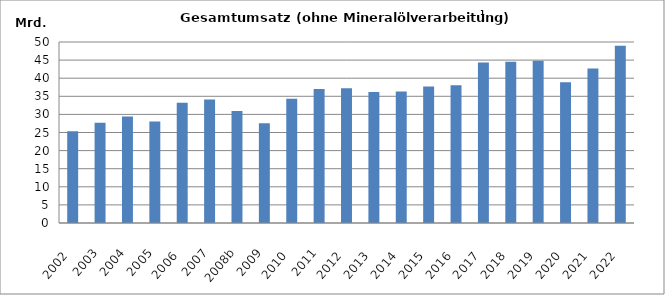
| Category | Series 1 |
|---|---|
| 2002  | 25322166.693 |
| 2003 | 27678709.853 |
| 2004 | 29399599.118 |
| 2005 | 28068624.714 |
| 2006  | 33185360.851 |
| 2007 | 34119646.051 |
| 2008b | 30915600.271 |
| 2009 | 27521316.637 |
| 2010  | 34332768.486 |
| 2011 | 37004422.262 |
| 2012  | 37206235.695 |
| 2013  | 36200697.321 |
| 2014  | 36332803.449 |
| 2015  | 37693837.925 |
| 2016  | 38036870.621 |
| 2017  | 44327215.865 |
| 2018  | 44522389.348 |
| 2019  | 44820794.924 |
| 2020  | 38855651.718 |
| 2021  | 42649642.331 |
| 2022  | 48975703.686 |